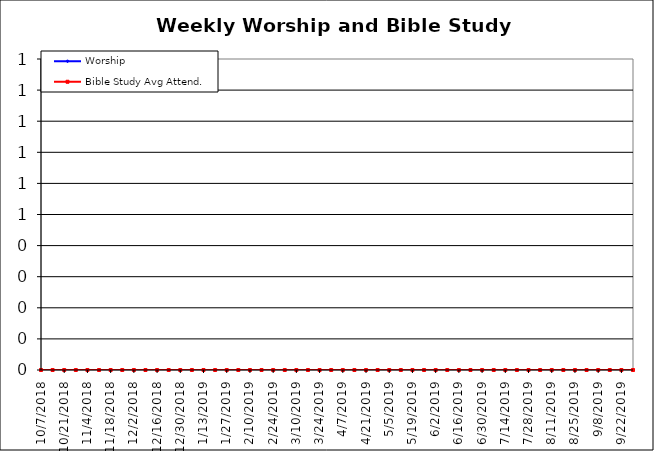
| Category | Worship | Bible Study Avg Attend. |
|---|---|---|
| 10/7/18 | 0 | 0 |
| 10/14/18 | 0 | 0 |
| 10/21/18 | 0 | 0 |
| 10/28/18 | 0 | 0 |
| 11/4/18 | 0 | 0 |
| 11/11/18 | 0 | 0 |
| 11/18/18 | 0 | 0 |
| 11/25/18 | 0 | 0 |
| 12/2/18 | 0 | 0 |
| 12/9/18 | 0 | 0 |
| 12/16/18 | 0 | 0 |
| 12/23/18 | 0 | 0 |
| 12/30/18 | 0 | 0 |
| 1/6/19 | 0 | 0 |
| 1/13/19 | 0 | 0 |
| 1/20/19 | 0 | 0 |
| 1/27/19 | 0 | 0 |
| 2/3/19 | 0 | 0 |
| 2/10/19 | 0 | 0 |
| 2/17/19 | 0 | 0 |
| 2/24/19 | 0 | 0 |
| 3/3/19 | 0 | 0 |
| 3/10/19 | 0 | 0 |
| 3/17/19 | 0 | 0 |
| 3/24/19 | 0 | 0 |
| 3/31/19 | 0 | 0 |
| 4/7/19 | 0 | 0 |
| 4/14/19 | 0 | 0 |
| 4/21/19 | 0 | 0 |
| 4/28/19 | 0 | 0 |
| 5/5/19 | 0 | 0 |
| 5/12/19 | 0 | 0 |
| 5/19/19 | 0 | 0 |
| 5/26/19 | 0 | 0 |
| 6/2/19 | 0 | 0 |
| 6/9/19 | 0 | 0 |
| 6/16/19 | 0 | 0 |
| 6/23/19 | 0 | 0 |
| 6/30/19 | 0 | 0 |
| 7/7/19 | 0 | 0 |
| 7/14/19 | 0 | 0 |
| 7/21/19 | 0 | 0 |
| 7/28/19 | 0 | 0 |
| 8/4/19 | 0 | 0 |
| 8/11/19 | 0 | 0 |
| 8/18/19 | 0 | 0 |
| 8/25/19 | 0 | 0 |
| 9/1/19 | 0 | 0 |
| 9/8/19 | 0 | 0 |
| 9/15/19 | 0 | 0 |
| 9/22/19 | 0 | 0 |
| 9/29/19 | 0 | 0 |